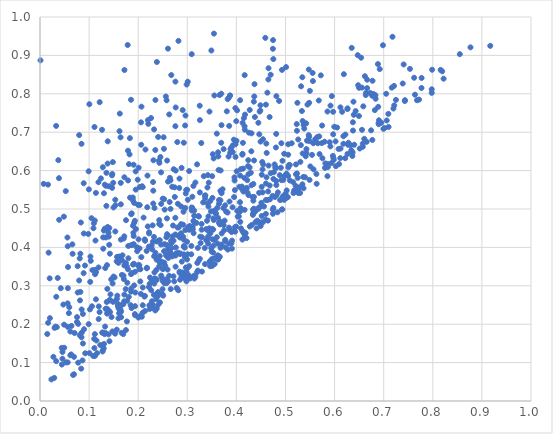
| Category | Series 0 |
|---|---|
| 0.5426690927847749 | 0.656 |
| 0.40748443905289433 | 0.493 |
| 0.17776072125496867 | 0.308 |
| 0.098306803038813 | 0.435 |
| 0.7406866198305129 | 0.876 |
| 0.6512083403906029 | 0.658 |
| 0.29772295523592407 | 0.55 |
| 0.3823981693558042 | 0.394 |
| 0.3039271799257667 | 0.446 |
| 0.07666712317414426 | 0.351 |
| 0.16678873307836795 | 0.328 |
| 0.3090873031860578 | 0.496 |
| 0.40904099528206583 | 0.604 |
| 0.08968314742189776 | 0.187 |
| 0.355739291243083 | 0.357 |
| 0.49384486251908 | 0.626 |
| 0.1336099574365638 | 0.24 |
| 0.4526501927608003 | 0.622 |
| 0.6262744677928441 | 0.644 |
| 0.5126307115709625 | 0.671 |
| 0.44585645391710005 | 0.504 |
| 0.29143429862962755 | 0.428 |
| 0.2987300556381465 | 0.824 |
| 0.29945775605838165 | 0.415 |
| 0.763717922221608 | 0.798 |
| 0.5349684887249235 | 0.729 |
| 0.2046062923294727 | 0.343 |
| 0.3452085384744359 | 0.754 |
| 0.02320424418396494 | 0.056 |
| 0.19533977124773527 | 0.448 |
| 0.39529479158039094 | 0.531 |
| 0.49177622982739244 | 0.575 |
| 0.298259786241298 | 0.312 |
| 0.20427381199220307 | 0.311 |
| 0.12678817068828707 | 0.178 |
| 0.06404419015060414 | 0.196 |
| 0.4462559631602028 | 0.542 |
| 0.3410699018377501 | 0.556 |
| 0.08905275693844927 | 0.567 |
| 0.5971658618198448 | 0.695 |
| 0.2689136699963254 | 0.376 |
| 0.36641020849841344 | 0.46 |
| 0.03901838151409687 | 0.472 |
| 0.08325366603420614 | 0.465 |
| 0.5540359775381473 | 0.641 |
| 0.08225799876988171 | 0.284 |
| 0.2676445706192456 | 0.411 |
| 0.1596885757642852 | 0.36 |
| 0.13785942412043972 | 0.453 |
| 0.1695858060131945 | 0.174 |
| 0.14147393169762157 | 0.156 |
| 0.17948293053105469 | 0.574 |
| 0.579623357259275 | 0.675 |
| 0.14890315519236863 | 0.258 |
| 0.4521474750455713 | 0.465 |
| 0.25736378302420815 | 0.378 |
| 0.352747504610182 | 0.446 |
| 0.20883109291474833 | 0.23 |
| 0.19021712745985675 | 0.438 |
| 0.1619068359335858 | 0.703 |
| 0.16467108726719704 | 0.42 |
| 0.2760894873763031 | 0.379 |
| 0.28730096924982484 | 0.437 |
| 0.5229270352369966 | 0.721 |
| 0.12631293541277377 | 0.706 |
| 0.16270923246112623 | 0.37 |
| 0.2598515516896298 | 0.342 |
| 0.18235934195019543 | 0.642 |
| 0.3650527344192215 | 0.374 |
| 0.36578932251952556 | 0.797 |
| 0.13264175051016025 | 0.194 |
| 0.230728198539915 | 0.548 |
| 0.24320255880597508 | 0.62 |
| 0.23485465617844992 | 0.236 |
| 0.691924638428129 | 0.864 |
| 0.18553515215066863 | 0.285 |
| 0.10064093852996536 | 0.125 |
| 0.1891543855680088 | 0.523 |
| 0.42104548366449845 | 0.555 |
| 0.6743829264804375 | 0.705 |
| 0.5646216550186702 | 0.687 |
| 0.605194766608469 | 0.712 |
| 0.4002334031162821 | 0.678 |
| 0.22760711375344667 | 0.315 |
| 0.2331530181416157 | 0.503 |
| 0.6390718383917884 | 0.745 |
| 0.12763398511894153 | 0.178 |
| 0.2710069132760623 | 0.457 |
| 0.21383176007477778 | 0.234 |
| 0.7769752804307338 | 0.815 |
| 0.3844508579645567 | 0.79 |
| 0.4119873125839726 | 0.551 |
| 0.35842940478544216 | 0.373 |
| 0.3454944814616894 | 0.363 |
| 0.014818901702604359 | 0.174 |
| 0.6384031247079252 | 0.779 |
| 0.22821404922368427 | 0.395 |
| 0.21892189788071126 | 0.587 |
| 0.4784258056520031 | 0.531 |
| 0.32986536642346775 | 0.426 |
| 0.3361081217745284 | 0.356 |
| 0.39114565950059066 | 0.418 |
| 0.1396060587142801 | 0.173 |
| 0.5303088987264044 | 0.623 |
| 0.16448862891568006 | 0.568 |
| 0.44659771303554674 | 0.695 |
| 0.1719730527286656 | 0.862 |
| 0.22193906441699873 | 0.297 |
| 0.3418587068339115 | 0.514 |
| 0.2574715964899206 | 0.426 |
| 0.10170971575946264 | 0.239 |
| 0.3322998456334014 | 0.517 |
| 0.5411588111712328 | 0.637 |
| 0.4735820299722314 | 0.534 |
| 0.23206683949953566 | 0.427 |
| 0.5367368143109926 | 0.554 |
| 0.1394256591045525 | 0.438 |
| 0.24572185783716627 | 0.458 |
| 0.16408809259877233 | 0.687 |
| 0.06178139939606864 | 0.181 |
| 0.6026857549664776 | 0.611 |
| 0.32042856208189174 | 0.359 |
| 0.2763842239768066 | 0.764 |
| 0.5249400045166811 | 0.581 |
| 0.7677529022250208 | 0.783 |
| 0.2079111157502881 | 0.559 |
| 0.3859690953327337 | 0.52 |
| 0.2701679635379688 | 0.429 |
| 0.7430281557530911 | 0.781 |
| 0.7772233730979505 | 0.841 |
| 0.4447186034415872 | 0.725 |
| 0.42725253648840467 | 0.454 |
| 0.34019360018333056 | 0.42 |
| 0.3436742215237544 | 0.569 |
| 0.35126964442616404 | 0.448 |
| 0.04575818962999767 | 0.128 |
| 0.3164996192024411 | 0.569 |
| 0.3575665919151335 | 0.489 |
| 0.4595840232523313 | 0.472 |
| 0.20668349841055345 | 0.767 |
| 0.2649110750851351 | 0.388 |
| 0.29151062401923755 | 0.459 |
| 0.43642963550988345 | 0.793 |
| 0.2876807897706598 | 0.507 |
| 0.2733914084532886 | 0.312 |
| 0.5965906843021604 | 0.638 |
| 0.2840875819545149 | 0.579 |
| 0.22297572209982697 | 0.249 |
| 0.3963188783305811 | 0.574 |
| 0.20259609035245363 | 0.343 |
| 0.23490511640039924 | 0.386 |
| 0.4308261749520559 | 0.562 |
| 0.28086133473990693 | 0.514 |
| 0.249597489597152 | 0.291 |
| 0.474436226373694 | 0.488 |
| 0.36458799724134505 | 0.523 |
| 0.5234894833056046 | 0.592 |
| 0.4269544528622733 | 0.608 |
| 0.13592792690024602 | 0.258 |
| 0.2579380454915876 | 0.307 |
| 0.1027149911714117 | 0.376 |
| 0.02729923824884195 | 0.115 |
| 0.3355926018035942 | 0.398 |
| 0.6555864213734712 | 0.816 |
| 0.5570082294889565 | 0.603 |
| 0.23998225665959116 | 0.282 |
| 0.5552457212886791 | 0.854 |
| 0.5381846137631078 | 0.71 |
| 0.4813387035243262 | 0.562 |
| 0.29297169265580447 | 0.382 |
| 0.246808458010769 | 0.513 |
| 0.5975155619012921 | 0.633 |
| 0.5009825338990274 | 0.589 |
| 0.03607929393190601 | 0.32 |
| 0.2338155275011582 | 0.378 |
| 0.3557903090428195 | 0.419 |
| 0.6573994460231917 | 0.67 |
| 0.4561959325890399 | 0.507 |
| 0.36976723774134834 | 0.541 |
| 0.6653168446245703 | 0.675 |
| 0.36225046231982605 | 0.379 |
| 0.11392035541427281 | 0.265 |
| 0.6557931388190333 | 0.706 |
| 0.15307359600992343 | 0.175 |
| 0.34299522907688174 | 0.507 |
| 0.5558749501259389 | 0.833 |
| 0.31325079436731884 | 0.326 |
| 0.11204843225564254 | 0.117 |
| 0.08891069221512227 | 0.333 |
| 0.242824000126456 | 0.471 |
| 0.21278980187697016 | 0.272 |
| 0.3215640384325624 | 0.399 |
| 0.47783325415302436 | 0.616 |
| 0.5481757408360757 | 0.776 |
| 0.1585834942739619 | 0.247 |
| 0.7210247254738666 | 0.821 |
| 0.424115812936248 | 0.627 |
| 0.019694217750197418 | 0.319 |
| 0.21405974963942231 | 0.417 |
| 0.6428947137612322 | 0.755 |
| 0.3601415581066454 | 0.427 |
| 0.47464920706426517 | 0.94 |
| 0.24280531870246003 | 0.461 |
| 0.4532101000069845 | 0.603 |
| 0.2931066602583835 | 0.33 |
| 0.46005796842242985 | 0.487 |
| 0.1989742043229047 | 0.576 |
| 0.43461161007041627 | 0.498 |
| 0.4175046514081737 | 0.746 |
| 0.13287255923271224 | 0.346 |
| 0.5055044692877898 | 0.586 |
| 0.3536643206675648 | 0.632 |
| 0.5011433600462204 | 0.87 |
| 0.0010611626666960916 | 0.887 |
| 0.11097880581308406 | 0.714 |
| 0.179211834313716 | 0.652 |
| 0.5804194244397488 | 0.607 |
| 0.49560916303305236 | 0.576 |
| 0.16114123134318825 | 0.242 |
| 0.3691710488546217 | 0.8 |
| 0.29574605313940827 | 0.503 |
| 0.28440691688902775 | 0.334 |
| 0.24259202102294364 | 0.35 |
| 0.11074249572649242 | 0.138 |
| 0.32153486776669427 | 0.34 |
| 0.4743637734050874 | 0.917 |
| 0.5752042718862317 | 0.632 |
| 0.2374830580219397 | 0.368 |
| 0.007457961492896903 | 0.566 |
| 0.236773155176491 | 0.265 |
| 0.04913279449676855 | 0.199 |
| 0.209151692249663 | 0.557 |
| 0.661730754677154 | 0.846 |
| 0.14109916326811012 | 0.45 |
| 0.44918642266325404 | 0.676 |
| 0.5344667008508904 | 0.564 |
| 0.1426174859728957 | 0.232 |
| 0.3690948519695716 | 0.672 |
| 0.24066956781918136 | 0.688 |
| 0.33837710701990764 | 0.448 |
| 0.351031761791742 | 0.352 |
| 0.056538984938572456 | 0.193 |
| 0.4173112952045598 | 0.429 |
| 0.3994834443572247 | 0.454 |
| 0.6984943836748789 | 0.927 |
| 0.15976305268032043 | 0.215 |
| 0.46982369448374994 | 0.85 |
| 0.3512629320229187 | 0.529 |
| 0.19739768690226955 | 0.4 |
| 0.05709841795037318 | 0.349 |
| 0.20051081982330377 | 0.217 |
| 0.1022799426185349 | 0.31 |
| 0.6480548222001546 | 0.822 |
| 0.08148313142530517 | 0.262 |
| 0.45166963561072504 | 0.589 |
| 0.45342224668283193 | 0.543 |
| 0.5176946683538526 | 0.548 |
| 0.132000005464879 | 0.449 |
| 0.3542477204189485 | 0.957 |
| 0.24079061476971741 | 0.274 |
| 0.06636964489470476 | 0.383 |
| 0.3772209112456578 | 0.417 |
| 0.28528657212416675 | 0.316 |
| 0.6899601091066978 | 0.721 |
| 0.1190204865304183 | 0.57 |
| 0.4005777605354185 | 0.598 |
| 0.46761589089737055 | 0.74 |
| 0.504750341751381 | 0.531 |
| 0.5163253079861688 | 0.542 |
| 0.17978181079829259 | 0.404 |
| 0.1893786793197315 | 0.456 |
| 0.5258362362629129 | 0.551 |
| 0.14098532072948589 | 0.407 |
| 0.32561415184275855 | 0.543 |
| 0.5629406753937943 | 0.591 |
| 0.13418011608064995 | 0.56 |
| 0.42068643448955056 | 0.424 |
| 0.40499621558728394 | 0.481 |
| 0.18594758682663615 | 0.406 |
| 0.392216285578456 | 0.504 |
| 0.1917830385052569 | 0.301 |
| 0.22475522862313135 | 0.248 |
| 0.16394642105252188 | 0.238 |
| 0.3617077936557146 | 0.41 |
| 0.09203831573840004 | 0.124 |
| 0.16567844770821794 | 0.25 |
| 0.16524051089500436 | 0.233 |
| 0.4304282831085138 | 0.65 |
| 0.5496471815304016 | 0.808 |
| 0.5333988775956104 | 0.755 |
| 0.20313749158609606 | 0.51 |
| 0.611870512406475 | 0.765 |
| 0.42368995219174355 | 0.612 |
| 0.1718269555938362 | 0.277 |
| 0.2959170272742976 | 0.445 |
| 0.3009828539072861 | 0.524 |
| 0.3199298143014072 | 0.616 |
| 0.11974499679770301 | 0.246 |
| 0.4844790073461228 | 0.543 |
| 0.593445935187335 | 0.619 |
| 0.27419267273462866 | 0.556 |
| 0.448997640829514 | 0.77 |
| 0.18003137610178588 | 0.372 |
| 0.40145545762643775 | 0.757 |
| 0.5054582363455031 | 0.641 |
| 0.19089506256320388 | 0.408 |
| 0.32843458213032206 | 0.672 |
| 0.12992865792891428 | 0.444 |
| 0.4473968396154453 | 0.754 |
| 0.14906758926572894 | 0.568 |
| 0.2298644348607829 | 0.25 |
| 0.26041731597926676 | 0.431 |
| 0.5399877323057432 | 0.583 |
| 0.11162317351178885 | 0.341 |
| 0.5811525105157761 | 0.619 |
| 0.5342846964647364 | 0.843 |
| 0.6372468587408417 | 0.726 |
| 0.5862459527474763 | 0.609 |
| 0.45420219635269476 | 0.682 |
| 0.5089987362572003 | 0.574 |
| 0.6635209243589751 | 0.797 |
| 0.283590606437526 | 0.555 |
| 0.22335941662389247 | 0.248 |
| 0.4814321181000093 | 0.794 |
| 0.186735913722482 | 0.489 |
| 0.3430494812142464 | 0.481 |
| 0.28598905188856716 | 0.384 |
| 0.2756510739104848 | 0.477 |
| 0.4837796846095075 | 0.491 |
| 0.17078991677838462 | 0.317 |
| 0.11296722001576187 | 0.418 |
| 0.5993504551269859 | 0.714 |
| 0.5740283954873932 | 0.672 |
| 0.5487332370769624 | 0.677 |
| 0.6019738751263539 | 0.676 |
| 0.23000688588115992 | 0.415 |
| 0.3978528894415191 | 0.763 |
| 0.19064670088886038 | 0.615 |
| 0.17856119407988413 | 0.927 |
| 0.42039859662503576 | 0.552 |
| 0.6367314839191182 | 0.647 |
| 0.7978665300338108 | 0.802 |
| 0.11033534918946297 | 0.162 |
| 0.39684465632337185 | 0.452 |
| 0.1890274414243317 | 0.53 |
| 0.21849003736160566 | 0.505 |
| 0.6768285582883704 | 0.68 |
| 0.4247016368896287 | 0.536 |
| 0.16250585019482156 | 0.748 |
| 0.29286147051511335 | 0.673 |
| 0.09157385473977053 | 0.353 |
| 0.2668020272456807 | 0.382 |
| 0.5021184617291146 | 0.592 |
| 0.41883017573613057 | 0.437 |
| 0.4537822652702811 | 0.465 |
| 0.08740129617642367 | 0.227 |
| 0.4754457847088215 | 0.578 |
| 0.22613866582407616 | 0.737 |
| 0.17186390831826914 | 0.583 |
| 0.2372334339314095 | 0.342 |
| 0.16521034858883787 | 0.218 |
| 0.39609984083341376 | 0.582 |
| 0.27558330327775127 | 0.434 |
| 0.6121463677564063 | 0.657 |
| 0.5297099630331721 | 0.542 |
| 0.5066783365939502 | 0.614 |
| 0.10333307783392409 | 0.365 |
| 0.031492134025216445 | 0.194 |
| 0.31283552766151257 | 0.437 |
| 0.09917626669089818 | 0.2 |
| 0.1371084441377095 | 0.292 |
| 0.3139417463724723 | 0.496 |
| 0.34484706224187023 | 0.45 |
| 0.4307954631069504 | 0.697 |
| 0.7534897430011447 | 0.865 |
| 0.2820025244322558 | 0.938 |
| 0.3897449955823631 | 0.66 |
| 0.706145222424164 | 0.731 |
| 0.35850282337445605 | 0.488 |
| 0.37703925871146615 | 0.51 |
| 0.14572642189791551 | 0.219 |
| 0.3139518278576703 | 0.466 |
| 0.3255104542800692 | 0.37 |
| 0.8767585626743946 | 0.921 |
| 0.3636747579729649 | 0.602 |
| 0.2073954532246337 | 0.219 |
| 0.06922969656737632 | 0.115 |
| 0.28692347076867397 | 0.332 |
| 0.156556234275257 | 0.266 |
| 0.29536097017024554 | 0.319 |
| 0.2826508288889398 | 0.452 |
| 0.09963018114054001 | 0.551 |
| 0.16115046668349753 | 0.376 |
| 0.1381888663434806 | 0.448 |
| 0.24967126061816403 | 0.313 |
| 0.6349350897921754 | 0.65 |
| 0.4763412452119148 | 0.596 |
| 0.6662893371509503 | 0.837 |
| 0.6994783692484265 | 0.709 |
| 0.06920443059501047 | 0.07 |
| 0.25871313102129967 | 0.406 |
| 0.4368623980137035 | 0.825 |
| 0.6090452287131075 | 0.617 |
| 0.23802435893596985 | 0.883 |
| 0.7214821197779792 | 0.77 |
| 0.18652255721733435 | 0.242 |
| 0.1873125866647053 | 0.333 |
| 0.29482500810532686 | 0.399 |
| 0.41665078423219704 | 0.715 |
| 0.6262926577211408 | 0.762 |
| 0.4681837186820509 | 0.525 |
| 0.2372883738366709 | 0.315 |
| 0.2757194238914705 | 0.716 |
| 0.5482198524484003 | 0.688 |
| 0.29310755623635476 | 0.403 |
| 0.3820572863960666 | 0.491 |
| 0.1561883171538112 | 0.364 |
| 0.6115122391232177 | 0.632 |
| 0.22406993350864957 | 0.322 |
| 0.6495774935366017 | 0.742 |
| 0.23509311269329358 | 0.784 |
| 0.1215298235067287 | 0.778 |
| 0.5259754875247538 | 0.542 |
| 0.32565448176516965 | 0.732 |
| 0.5634434511654247 | 0.566 |
| 0.25268563701398683 | 0.39 |
| 0.7432952820971598 | 0.784 |
| 0.5900128562290436 | 0.674 |
| 0.5024769487343114 | 0.548 |
| 0.7619615503129545 | 0.842 |
| 0.3010191555451651 | 0.319 |
| 0.15189294250791474 | 0.322 |
| 0.24663654898679555 | 0.595 |
| 0.13658422175571483 | 0.228 |
| 0.41220010322828404 | 0.42 |
| 0.3982385465353797 | 0.636 |
| 0.1792703125162176 | 0.343 |
| 0.20070020705107616 | 0.421 |
| 0.31653249398399674 | 0.323 |
| 0.05678941711148855 | 0.294 |
| 0.36008313447707485 | 0.696 |
| 0.2640520033732816 | 0.518 |
| 0.46508759720031634 | 0.837 |
| 0.24428519539104576 | 0.257 |
| 0.35006508494230126 | 0.446 |
| 0.46133040112294277 | 0.583 |
| 0.4075715184310764 | 0.783 |
| 0.24653433017765658 | 0.408 |
| 0.4017255328230196 | 0.495 |
| 0.35104500558896423 | 0.421 |
| 0.38404383339003634 | 0.637 |
| 0.12131171736504798 | 0.231 |
| 0.19786978917127318 | 0.39 |
| 0.037338371233495704 | 0.627 |
| 0.20015570731264665 | 0.353 |
| 0.25860922948753473 | 0.475 |
| 0.6819903644374553 | 0.758 |
| 0.19326614931926545 | 0.226 |
| 0.2061779006239628 | 0.667 |
| 0.36765562978036426 | 0.399 |
| 0.07977926011175518 | 0.692 |
| 0.4642886294068924 | 0.47 |
| 0.4974208648405647 | 0.524 |
| 0.8191257178870778 | 0.859 |
| 0.41108856563612695 | 0.558 |
| 0.6902999373001742 | 0.731 |
| 0.27578849862966204 | 0.832 |
| 0.628083587305479 | 0.673 |
| 0.30383731322714924 | 0.351 |
| 0.4883411446702578 | 0.588 |
| 0.4465043773103735 | 0.463 |
| 0.22170217422318317 | 0.402 |
| 0.3529833119300827 | 0.404 |
| 0.07546747096646789 | 0.219 |
| 0.36743452537062926 | 0.523 |
| 0.12794343252883067 | 0.132 |
| 0.4271353699536047 | 0.758 |
| 0.03297804799633186 | 0.104 |
| 0.1833458008173644 | 0.53 |
| 0.4616964966993129 | 0.646 |
| 0.03425895880395835 | 0.192 |
| 0.42198597506999813 | 0.575 |
| 0.0852652305374273 | 0.178 |
| 0.056490664173042604 | 0.403 |
| 0.2719831548213738 | 0.418 |
| 0.22052254418878925 | 0.722 |
| 0.23023879358753596 | 0.57 |
| 0.12400728527707183 | 0.58 |
| 0.26581555826817993 | 0.5 |
| 0.6340126315019863 | 0.653 |
| 0.16464123677528097 | 0.512 |
| 0.34903139598699484 | 0.913 |
| 0.3269835313094014 | 0.411 |
| 0.6153466872907365 | 0.753 |
| 0.57187517170172 | 0.848 |
| 0.5506155597085872 | 0.611 |
| 0.4654945103760292 | 0.613 |
| 0.39691002492498184 | 0.549 |
| 0.46992349307091996 | 0.593 |
| 0.7179407770113533 | 0.948 |
| 0.5565874299432974 | 0.671 |
| 0.3008649846735023 | 0.382 |
| 0.37887337494683593 | 0.493 |
| 0.797777715960383 | 0.812 |
| 0.5436946906449004 | 0.678 |
| 0.25633846726894927 | 0.793 |
| 0.25375691683008683 | 0.307 |
| 0.41485649685398973 | 0.437 |
| 0.34229129607350295 | 0.428 |
| 0.5983280479570942 | 0.628 |
| 0.49260393224668875 | 0.499 |
| 0.21361791041743616 | 0.274 |
| 0.329297997348619 | 0.446 |
| 0.43551303893495574 | 0.78 |
| 0.5914261745212029 | 0.663 |
| 0.6081196180755811 | 0.656 |
| 0.41364721359577705 | 0.605 |
| 0.3054533725384383 | 0.319 |
| 0.21947843823921698 | 0.455 |
| 0.052465803876909134 | 0.547 |
| 0.12883878589273623 | 0.397 |
| 0.594416882990787 | 0.794 |
| 0.39970127874957684 | 0.729 |
| 0.2662455849773454 | 0.292 |
| 0.46010860417328336 | 0.772 |
| 0.5361706466116664 | 0.583 |
| 0.4805170255294904 | 0.66 |
| 0.37596246057099136 | 0.47 |
| 0.4508095905469961 | 0.507 |
| 0.1917725102007114 | 0.516 |
| 0.25753949904791285 | 0.317 |
| 0.6348793401477054 | 0.92 |
| 0.8220121015991172 | 0.839 |
| 0.08220512040108374 | 0.384 |
| 0.6329062146976782 | 0.666 |
| 0.3660733424351511 | 0.376 |
| 0.36450595649295847 | 0.514 |
| 0.10054454103559562 | 0.773 |
| 0.25241314403528325 | 0.657 |
| 0.14352719034577133 | 0.278 |
| 0.42938987134299467 | 0.594 |
| 0.01655971354462271 | 0.204 |
| 0.7098987431676197 | 0.714 |
| 0.24527248115534384 | 0.635 |
| 0.1907498810451549 | 0.43 |
| 0.3252786532214157 | 0.769 |
| 0.08743994558307389 | 0.15 |
| 0.12864595633643527 | 0.426 |
| 0.08095919946607211 | 0.172 |
| 0.08089213722377342 | 0.371 |
| 0.49288398168091196 | 0.862 |
| 0.2528107581002099 | 0.526 |
| 0.31407232580207034 | 0.482 |
| 0.36794230246789905 | 0.6 |
| 0.5659032851596202 | 0.671 |
| 0.044256366485661114 | 0.138 |
| 0.2109465018039708 | 0.478 |
| 0.1351829111398939 | 0.508 |
| 0.14748585755577925 | 0.181 |
| 0.04865521236443382 | 0.48 |
| 0.4126263019322812 | 0.724 |
| 0.03314353915720181 | 0.271 |
| 0.36276889843364013 | 0.477 |
| 0.06353228614150919 | 0.121 |
| 0.367518010896572 | 0.547 |
| 0.01754698987042136 | 0.386 |
| 0.1563362722848456 | 0.186 |
| 0.34186238871887653 | 0.588 |
| 0.2630207916089383 | 0.326 |
| 0.4515229345631936 | 0.558 |
| 0.2054730361440119 | 0.279 |
| 0.28525285321917493 | 0.426 |
| 0.34695112270179274 | 0.437 |
| 0.5232875266265647 | 0.704 |
| 0.521306038612849 | 0.616 |
| 0.40762370514879676 | 0.587 |
| 0.2766777537424189 | 0.4 |
| 0.3460769335698365 | 0.363 |
| 0.44464104783407554 | 0.5 |
| 0.26540728062096375 | 0.574 |
| 0.15860765119528397 | 0.253 |
| 0.6274395145179438 | 0.667 |
| 0.7094470255189683 | 0.748 |
| 0.23275133834735573 | 0.306 |
| 0.24418746322471074 | 0.362 |
| 0.16110311889038587 | 0.229 |
| 0.11499300245093158 | 0.158 |
| 0.03869900752272626 | 0.58 |
| 0.4914884296799443 | 0.525 |
| 0.3017388362021711 | 0.453 |
| 0.13945993186210603 | 0.236 |
| 0.46778206412398904 | 0.561 |
| 0.5349862932096593 | 0.645 |
| 0.1416914390918379 | 0.262 |
| 0.7985949044233671 | 0.863 |
| 0.47524040710256443 | 0.503 |
| 0.585427421636298 | 0.586 |
| 0.23062899891568078 | 0.514 |
| 0.16617977380916316 | 0.178 |
| 0.2999413806900276 | 0.55 |
| 0.19361634719542398 | 0.247 |
| 0.636223538997181 | 0.638 |
| 0.36085494766001536 | 0.503 |
| 0.3261773348863224 | 0.428 |
| 0.31856176171437334 | 0.464 |
| 0.28823386147120134 | 0.323 |
| 0.6574501610026166 | 0.662 |
| 0.4166765310056286 | 0.498 |
| 0.3081849026003787 | 0.382 |
| 0.21483099311353204 | 0.655 |
| 0.2801396813667054 | 0.452 |
| 0.08659659332870828 | 0.106 |
| 0.15339009689480454 | 0.442 |
| 0.22213770372943809 | 0.436 |
| 0.5473166178389592 | 0.693 |
| 0.2551054172448737 | 0.352 |
| 0.02019300892804088 | 0.216 |
| 0.14972463488261045 | 0.504 |
| 0.24104060081274814 | 0.251 |
| 0.5489197770640708 | 0.576 |
| 0.3298482544217045 | 0.337 |
| 0.7198143876943087 | 0.762 |
| 0.2612583671303136 | 0.312 |
| 0.12738618141191338 | 0.129 |
| 0.20041624940376013 | 0.353 |
| 0.26738600807256263 | 0.849 |
| 0.508711678618694 | 0.615 |
| 0.3804963916272296 | 0.754 |
| 0.22942217053794522 | 0.457 |
| 0.36934592718613146 | 0.544 |
| 0.3465130330828451 | 0.351 |
| 0.23677557470919253 | 0.317 |
| 0.29324007070158475 | 0.401 |
| 0.664140113871072 | 0.803 |
| 0.37012266373204317 | 0.437 |
| 0.3482449405509087 | 0.494 |
| 0.25377574125640323 | 0.409 |
| 0.08455277117479887 | 0.67 |
| 0.43366581416756067 | 0.485 |
| 0.2057877313612878 | 0.726 |
| 0.8550315476065862 | 0.903 |
| 0.2606289303081838 | 0.918 |
| 0.43453176601755084 | 0.522 |
| 0.43571403633273675 | 0.532 |
| 0.05643695424242601 | 0.101 |
| 0.17175978310983686 | 0.353 |
| 0.2021498934295105 | 0.354 |
| 0.3037329077918911 | 0.599 |
| 0.4255154689106886 | 0.699 |
| 0.1403641350880661 | 0.559 |
| 0.2092809457645769 | 0.296 |
| 0.248120361518002 | 0.321 |
| 0.7050544595251933 | 0.8 |
| 0.5284993303520755 | 0.556 |
| 0.2842285542816657 | 0.337 |
| 0.10838179901149103 | 0.117 |
| 0.6497847125929549 | 0.816 |
| 0.4493581590927763 | 0.456 |
| 0.46542012449933967 | 0.867 |
| 0.016288689858910188 | 0.563 |
| 0.24129754930507463 | 0.369 |
| 0.34966119707829535 | 0.389 |
| 0.19959751245994306 | 0.511 |
| 0.18945639717211538 | 0.355 |
| 0.2922583472664808 | 0.493 |
| 0.0753973337244146 | 0.206 |
| 0.25889984745058325 | 0.626 |
| 0.6725780676331723 | 0.802 |
| 0.6831698020780856 | 0.796 |
| 0.11172478431381794 | 0.174 |
| 0.4812348611548827 | 0.607 |
| 0.17460011664086728 | 0.291 |
| 0.56870054644166 | 0.689 |
| 0.22790369724989323 | 0.26 |
| 0.3626028488908678 | 0.648 |
| 0.4588992719265991 | 0.946 |
| 0.2745160302824883 | 0.531 |
| 0.38582400858711285 | 0.446 |
| 0.23485707853889137 | 0.654 |
| 0.3750782161959395 | 0.445 |
| 0.21330313213381358 | 0.421 |
| 0.3545344981548568 | 0.495 |
| 0.24398236781314564 | 0.419 |
| 0.17144940302426248 | 0.26 |
| 0.20646310022200842 | 0.375 |
| 0.3880641076790272 | 0.656 |
| 0.2578390838923458 | 0.783 |
| 0.231058568194347 | 0.627 |
| 0.264510792742898 | 0.581 |
| 0.27962131497865594 | 0.674 |
| 0.2850274274383161 | 0.383 |
| 0.14969808190642997 | 0.324 |
| 0.39486091489356334 | 0.68 |
| 0.07037650235966453 | 0.177 |
| 0.061755828323243445 | 0.119 |
| 0.4170824925091482 | 0.707 |
| 0.38744728337381673 | 0.647 |
| 0.10684985537840042 | 0.341 |
| 0.30526660940196837 | 0.456 |
| 0.0673629688443036 | 0.068 |
| 0.135301065127437 | 0.594 |
| 0.524229211818059 | 0.777 |
| 0.24149838121256428 | 0.418 |
| 0.19373465874338736 | 0.223 |
| 0.2763993338653845 | 0.6 |
| 0.18540182861456034 | 0.33 |
| 0.08387577533111124 | 0.084 |
| 0.14837668313765695 | 0.622 |
| 0.2405589023883994 | 0.283 |
| 0.1935647317520155 | 0.337 |
| 0.3981972384243705 | 0.669 |
| 0.5854735175634668 | 0.754 |
| 0.05588667928369839 | 0.426 |
| 0.451520749332593 | 0.482 |
| 0.26065683642080517 | 0.395 |
| 0.4410401835877993 | 0.45 |
| 0.24681158374764 | 0.327 |
| 0.1913383829703329 | 0.357 |
| 0.34881021449634186 | 0.398 |
| 0.7249350238610099 | 0.784 |
| 0.2049994551828659 | 0.222 |
| 0.43449939329978915 | 0.565 |
| 0.31093425118681517 | 0.454 |
| 0.6896180665007134 | 0.723 |
| 0.44870901887320047 | 0.756 |
| 0.3822008855141469 | 0.786 |
| 0.25311934304526285 | 0.36 |
| 0.6767491104785206 | 0.795 |
| 0.23775936578910117 | 0.241 |
| 0.23311721769373606 | 0.335 |
| 0.37399389431021046 | 0.458 |
| 0.39038165195762864 | 0.44 |
| 0.5447621563591345 | 0.772 |
| 0.13033347721912847 | 0.148 |
| 0.32208467466585555 | 0.482 |
| 0.07977135640258304 | 0.314 |
| 0.17688505971876745 | 0.35 |
| 0.39584147661012203 | 0.443 |
| 0.5312665668350272 | 0.666 |
| 0.11216284102614393 | 0.33 |
| 0.2632187944661398 | 0.746 |
| 0.08450947813507237 | 0.166 |
| 0.5002096664711216 | 0.54 |
| 0.32907647304518994 | 0.461 |
| 0.26526585635683675 | 0.576 |
| 0.18795507065217498 | 0.406 |
| 0.5206484624124896 | 0.56 |
| 0.36267547105778 | 0.368 |
| 0.22225551162474366 | 0.439 |
| 0.42249904914075254 | 0.543 |
| 0.40736340170518104 | 0.518 |
| 0.6188102403688871 | 0.851 |
| 0.3898231932083609 | 0.411 |
| 0.5420279291297817 | 0.723 |
| 0.3849483578310062 | 0.452 |
| 0.6772463419320182 | 0.834 |
| 0.5474847647053176 | 0.863 |
| 0.5678062741819441 | 0.783 |
| 0.11384430397164402 | 0.542 |
| 0.2883563451000045 | 0.607 |
| 0.6604208665356636 | 0.683 |
| 0.07781149421098865 | 0.201 |
| 0.29272672669970035 | 0.42 |
| 0.29684582883662025 | 0.541 |
| 0.24224814623924462 | 0.626 |
| 0.3907901287844079 | 0.397 |
| 0.2517811552217891 | 0.687 |
| 0.18086087298042253 | 0.271 |
| 0.19492786323333056 | 0.55 |
| 0.17499317632050115 | 0.359 |
| 0.6788937858975913 | 0.8 |
| 0.44246197478168625 | 0.47 |
| 0.4078361778848969 | 0.466 |
| 0.22345466011095239 | 0.24 |
| 0.4936190448775548 | 0.499 |
| 0.29061987450192794 | 0.758 |
| 0.44880632752935834 | 0.465 |
| 0.4600888013631783 | 0.523 |
| 0.1716453563792003 | 0.429 |
| 0.11403341626409624 | 0.335 |
| 0.12274714231393413 | 0.146 |
| 0.21784094862360193 | 0.347 |
| 0.16023073771600382 | 0.241 |
| 0.40272611801056657 | 0.48 |
| 0.45459720137194937 | 0.616 |
| 0.5693625559137487 | 0.643 |
| 0.33600590106320916 | 0.534 |
| 0.3101901461718385 | 0.503 |
| 0.36971896327469145 | 0.718 |
| 0.3643126762901775 | 0.464 |
| 0.2764709807087258 | 0.384 |
| 0.4890216268962323 | 0.523 |
| 0.3194282590571632 | 0.335 |
| 0.045724854493264466 | 0.11 |
| 0.15367971984385576 | 0.51 |
| 0.26747424336523973 | 0.398 |
| 0.41435919152285117 | 0.546 |
| 0.38701853450182333 | 0.796 |
| 0.18308319573958853 | 0.685 |
| 0.4915646036836787 | 0.671 |
| 0.06595917628070291 | 0.408 |
| 0.1857400538386964 | 0.486 |
| 0.3336523884616023 | 0.586 |
| 0.07681023320031344 | 0.283 |
| 0.20092876982287222 | 0.608 |
| 0.23248020599752028 | 0.377 |
| 0.13767821733349017 | 0.618 |
| 0.35393230600946624 | 0.471 |
| 0.5426147279602008 | 0.646 |
| 0.13025153159602176 | 0.541 |
| 0.33860259490681854 | 0.419 |
| 0.34219976621206283 | 0.443 |
| 0.3734197706901584 | 0.502 |
| 0.19174749484877396 | 0.464 |
| 0.23771763335256668 | 0.415 |
| 0.09906444144345672 | 0.598 |
| 0.1698641868231493 | 0.252 |
| 0.03282786945192917 | 0.716 |
| 0.2888349091194895 | 0.363 |
| 0.287218035459727 | 0.46 |
| 0.3498260624679781 | 0.369 |
| 0.2483091770072393 | 0.363 |
| 0.46308847217585014 | 0.803 |
| 0.3124245305647706 | 0.469 |
| 0.3029454908476805 | 0.327 |
| 0.36311899169932316 | 0.637 |
| 0.4905386759297391 | 0.607 |
| 0.5604669943489409 | 0.682 |
| 0.18598058173484977 | 0.293 |
| 0.16718672103024645 | 0.366 |
| 0.2969361638990313 | 0.348 |
| 0.08486006261085499 | 0.238 |
| 0.39749957688772153 | 0.441 |
| 0.6220352124054308 | 0.694 |
| 0.6584642335694904 | 0.767 |
| 0.6400325720223952 | 0.667 |
| 0.26689684839903083 | 0.417 |
| 0.35401248918884154 | 0.371 |
| 0.4609410938642946 | 0.67 |
| 0.36960311915647626 | 0.407 |
| 0.49737127140998005 | 0.644 |
| 0.14662596182992005 | 0.588 |
| 0.3925738391672948 | 0.666 |
| 0.2611972339521865 | 0.373 |
| 0.3551253586483404 | 0.796 |
| 0.4359743830431978 | 0.626 |
| 0.05632011534878234 | 0.254 |
| 0.28141922612211145 | 0.431 |
| 0.15330424980824708 | 0.524 |
| 0.29952640926329666 | 0.369 |
| 0.5057948306187399 | 0.608 |
| 0.15687781783092358 | 0.375 |
| 0.35334997483639197 | 0.476 |
| 0.1298042038538766 | 0.137 |
| 0.4869238521721767 | 0.781 |
| 0.047532166617435756 | 0.251 |
| 0.4508248234402079 | 0.516 |
| 0.49870906793673586 | 0.586 |
| 0.3363894901129769 | 0.528 |
| 0.4339592967188455 | 0.489 |
| 0.24939577683282588 | 0.345 |
| 0.17519726410577618 | 0.471 |
| 0.17702632898132264 | 0.207 |
| 0.6883068835459103 | 0.877 |
| 0.13192580674704113 | 0.563 |
| 0.30897406345524314 | 0.903 |
| 0.2949718632700489 | 0.375 |
| 0.30090210659396877 | 0.831 |
| 0.28159781897257596 | 0.288 |
| 0.5970685229644846 | 0.753 |
| 0.29558159115110005 | 0.717 |
| 0.17001721608059328 | 0.327 |
| 0.05273038875038294 | 0.101 |
| 0.18113967553749133 | 0.617 |
| 0.312496444153897 | 0.56 |
| 0.29847662236201666 | 0.336 |
| 0.049346672158579685 | 0.139 |
| 0.34015901487673117 | 0.469 |
| 0.3111990763926278 | 0.447 |
| 0.19421159559117096 | 0.283 |
| 0.43770794885970754 | 0.74 |
| 0.21714253149162566 | 0.391 |
| 0.43428228846023065 | 0.499 |
| 0.04449114918893271 | 0.095 |
| 0.21984418637042424 | 0.731 |
| 0.22659990122991447 | 0.288 |
| 0.6471077095145036 | 0.901 |
| 0.14790384353513486 | 0.306 |
| 0.5317935745741799 | 0.819 |
| 0.3849430146829962 | 0.41 |
| 0.43772429465898477 | 0.492 |
| 0.3519439570108903 | 0.643 |
| 0.059585719090531786 | 0.244 |
| 0.4332523413967261 | 0.531 |
| 0.5916759433645252 | 0.769 |
| 0.18532543383920919 | 0.784 |
| 0.47522983457368684 | 0.89 |
| 0.18454814747900516 | 0.25 |
| 0.6374926640455243 | 0.704 |
| 0.5055336369893166 | 0.669 |
| 0.1191698554623335 | 0.348 |
| 0.1362012630252475 | 0.24 |
| 0.20335429831940388 | 0.557 |
| 0.4151943783193135 | 0.737 |
| 0.25708061536302884 | 0.38 |
| 0.19484796377952374 | 0.598 |
| 0.3232304674083527 | 0.366 |
| 0.30021189107923063 | 0.346 |
| 0.2538893743491123 | 0.498 |
| 0.25051844843092497 | 0.344 |
| 0.14504901323156316 | 0.317 |
| 0.6261701810367076 | 0.76 |
| 0.36289843390063214 | 0.369 |
| 0.4646243459946564 | 0.546 |
| 0.3853054828615805 | 0.716 |
| 0.4810949475727323 | 0.696 |
| 0.40840933436577165 | 0.502 |
| 0.4061144835442553 | 0.558 |
| 0.2718363270631372 | 0.325 |
| 0.37722992389043664 | 0.42 |
| 0.07776219340860968 | 0.1 |
| 0.7387515049829572 | 0.827 |
| 0.23234846672565235 | 0.707 |
| 0.21752920911978224 | 0.346 |
| 0.5745901566525614 | 0.717 |
| 0.2784717403156143 | 0.294 |
| 0.10493865304513161 | 0.476 |
| 0.6835900163526265 | 0.787 |
| 0.6179500226935801 | 0.69 |
| 0.22803074287195624 | 0.243 |
| 0.11952409935440145 | 0.213 |
| 0.3681757902589491 | 0.466 |
| 0.17503900996101007 | 0.185 |
| 0.10887776046059083 | 0.45 |
| 0.13645303115805218 | 0.354 |
| 0.6887752218805405 | 0.766 |
| 0.7719953935105863 | 0.785 |
| 0.1161696524221264 | 0.125 |
| 0.14242215524029422 | 0.384 |
| 0.6662375321368867 | 0.815 |
| 0.62159254055295 | 0.632 |
| 0.48103702386088243 | 0.573 |
| 0.32378019383404144 | 0.481 |
| 0.13792049976040088 | 0.676 |
| 0.05883252150181273 | 0.229 |
| 0.0892382004353185 | 0.436 |
| 0.22328787049315446 | 0.305 |
| 0.3718401348845589 | 0.551 |
| 0.4122170518555971 | 0.443 |
| 0.10585063054832122 | 0.247 |
| 0.14001454772252975 | 0.428 |
| 0.02960551895205743 | 0.19 |
| 0.336823668302196 | 0.536 |
| 0.23204514098600115 | 0.276 |
| 0.34259573007369704 | 0.41 |
| 0.48185079692981536 | 0.535 |
| 0.4121395385097748 | 0.641 |
| 0.4132788143673678 | 0.672 |
| 0.2722774747263693 | 0.604 |
| 0.2446585502892169 | 0.359 |
| 0.6951501382318154 | 0.725 |
| 0.25875166013775397 | 0.434 |
| 0.14727288721582565 | 0.591 |
| 0.4093009941542085 | 0.45 |
| 0.10964909262706246 | 0.463 |
| 0.2336054727581458 | 0.319 |
| 0.12802311252679066 | 0.609 |
| 0.25096659222712725 | 0.274 |
| 0.35066989686772265 | 0.585 |
| 0.43870774446713956 | 0.465 |
| 0.6178591706987162 | 0.67 |
| 0.29634844581133035 | 0.743 |
| 0.41671480539007155 | 0.439 |
| 0.5213204769826084 | 0.591 |
| 0.7016478385392301 | 0.711 |
| 0.028954801661926877 | 0.06 |
| 0.9169840068715172 | 0.925 |
| 0.42434680577509387 | 0.59 |
| 0.4312778141999205 | 0.458 |
| 0.15749123387702424 | 0.274 |
| 0.20924307842870238 | 0.249 |
| 0.1704485356465537 | 0.423 |
| 0.24989020023526254 | 0.527 |
| 0.3776095910179178 | 0.4 |
| 0.13399025694221622 | 0.426 |
| 0.14696832658754044 | 0.555 |
| 0.3870364467923466 | 0.795 |
| 0.8159691614743182 | 0.862 |
| 0.5369352698078902 | 0.719 |
| 0.24936614453272665 | 0.278 |
| 0.042358313857958074 | 0.294 |
| 0.2904268707065619 | 0.335 |
| 0.260694450145315 | 0.571 |
| 0.4632165946575221 | 0.523 |
| 0.11155117230686273 | 0.47 |
| 0.47416017683154443 | 0.498 |
| 0.3103020834391551 | 0.532 |
| 0.3527006209950957 | 0.386 |
| 0.30825620026693634 | 0.404 |
| 0.22751523613551083 | 0.405 |
| 0.41252036613785614 | 0.644 |
| 0.5259316301469021 | 0.681 |
| 0.2026535817957117 | 0.397 |
| 0.3924504342607431 | 0.648 |
| 0.4167865467728521 | 0.849 |
| 0.47905899841577837 | 0.608 |
| 0.7164462356424485 | 0.816 |
| 0.1932410160375151 | 0.469 |
| 0.2761254053199673 | 0.35 |
| 0.5862313834902576 | 0.617 |
| 0.28125129634389023 | 0.386 |
| 0.1679985231151322 | 0.379 |
| 0.1776048166518126 | 0.261 |
| 0.3144088312325083 | 0.319 |
| 0.24395606850705875 | 0.377 |
| 0.5157238334352254 | 0.57 |
| 0.14222633951599617 | 0.264 |
| 0.43584224779851777 | 0.501 |
| 0.4947175527050207 | 0.533 |
| 0.4601427647625723 | 0.566 |
| 0.5027884828011949 | 0.529 |
| 0.13166668770220236 | 0.174 |
| 0.2692081286182795 | 0.558 |
| 0.30889311999976254 | 0.504 |
| 0.3740282489503116 | 0.656 |
| 0.4161991285782374 | 0.581 |
| 0.3466568106320548 | 0.521 |
| 0.653995139416724 | 0.894 |
| 0.13304885004463918 | 0.177 |